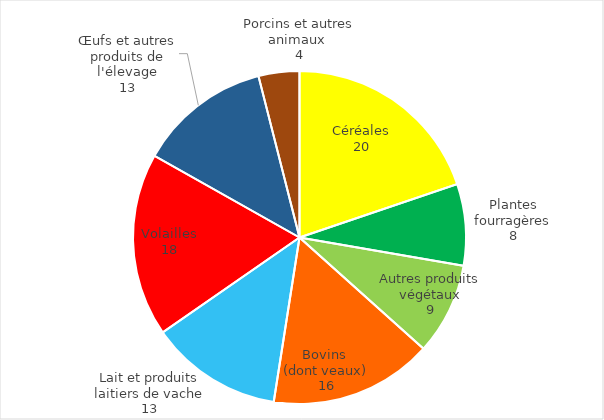
| Category | Series 0 |
|---|---|
| Céréales | 20 |
| Plantes fourragères | 8 |
| Autres produits végétaux | 9 |
| Bovins 
(dont veaux) | 16 |
| Lait et produits laitiers de vache | 13 |
| Volailles | 18 |
| Œufs et autres produits de l'élevage | 13 |
| Porcins et autres animaux  | 4 |